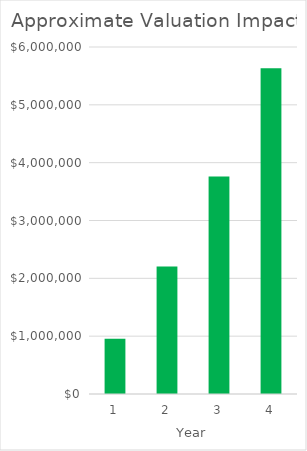
| Category | Series 1 |
|---|---|
| 0 | 957207.031 |
| 1 | 2204225.26 |
| 2 | 3762610.677 |
| 3 | 5630996.094 |